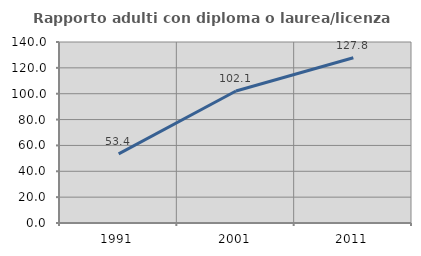
| Category | Rapporto adulti con diploma o laurea/licenza media  |
|---|---|
| 1991.0 | 53.415 |
| 2001.0 | 102.077 |
| 2011.0 | 127.829 |